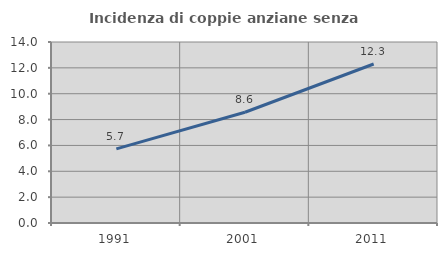
| Category | Incidenza di coppie anziane senza figli  |
|---|---|
| 1991.0 | 5.729 |
| 2001.0 | 8.566 |
| 2011.0 | 12.297 |